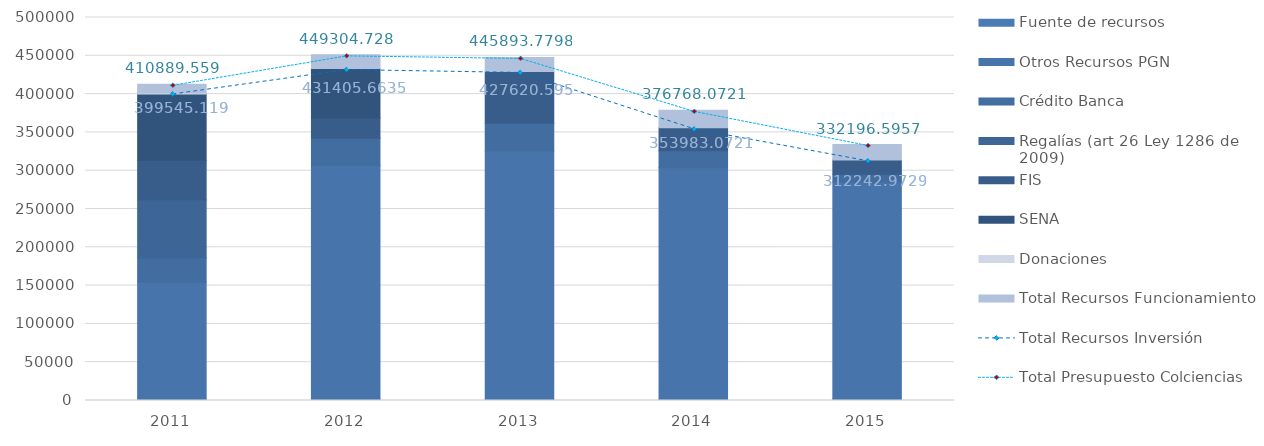
| Category | Fuente de recursos | Otros Recursos PGN | Crédito Banca | Regalías (art 26 Ley 1286 de 2009) | FIS | SENA | Donaciones | Total Recursos Funcionamiento |
|---|---|---|---|---|---|---|---|---|
| 2011.0 | 2011 | 152444.342 | 31602.971 | 75774.564 | 51770.264 | 86421.332 | 1531.646 | 11344.44 |
| 2012.0 | 2012 | 304705.157 | 35787.826 | 0 | 26417.751 | 64437.741 | 57.189 | 17899.065 |
| 2013.0 | 2013 | 323624.755 | 36349.73 | 0 | 67379 | 0 | 267.111 | 18273.185 |
| 2014.0 | 2014 | 301746.368 | 22236.704 | 0 | 30000 | 0 | 0 | 22785 |
| 2015.0 | 2015 | 283327.055 | 10110.518 | 0 | 18731.854 | 0 | 73.546 | 19953.623 |